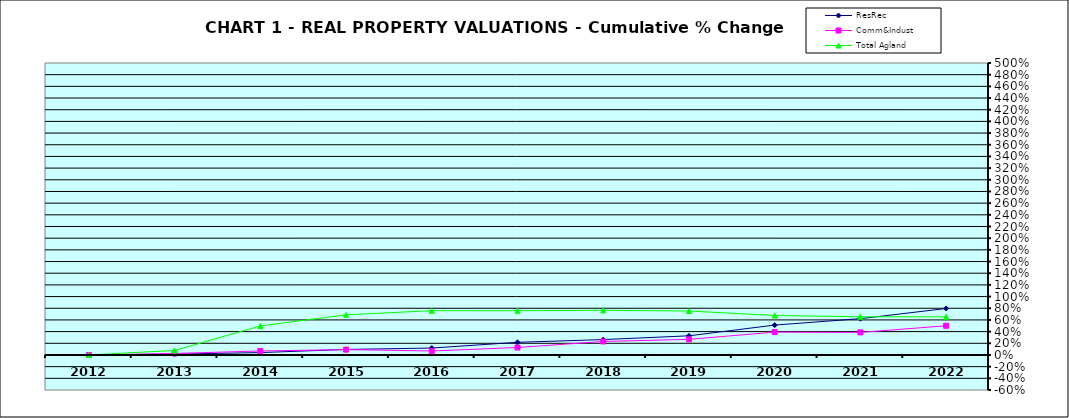
| Category | ResRec | Comm&Indust | Total Agland |
|---|---|---|---|
| 2012.0 | 0 | 0 | 0 |
| 2013.0 | 0.015 | 0.026 | 0.077 |
| 2014.0 | 0.041 | 0.068 | 0.497 |
| 2015.0 | 0.095 | 0.092 | 0.688 |
| 2016.0 | 0.119 | 0.068 | 0.758 |
| 2017.0 | 0.217 | 0.128 | 0.758 |
| 2018.0 | 0.263 | 0.231 | 0.764 |
| 2019.0 | 0.328 | 0.268 | 0.753 |
| 2020.0 | 0.512 | 0.391 | 0.676 |
| 2021.0 | 0.622 | 0.387 | 0.654 |
| 2022.0 | 0.796 | 0.5 | 0.653 |